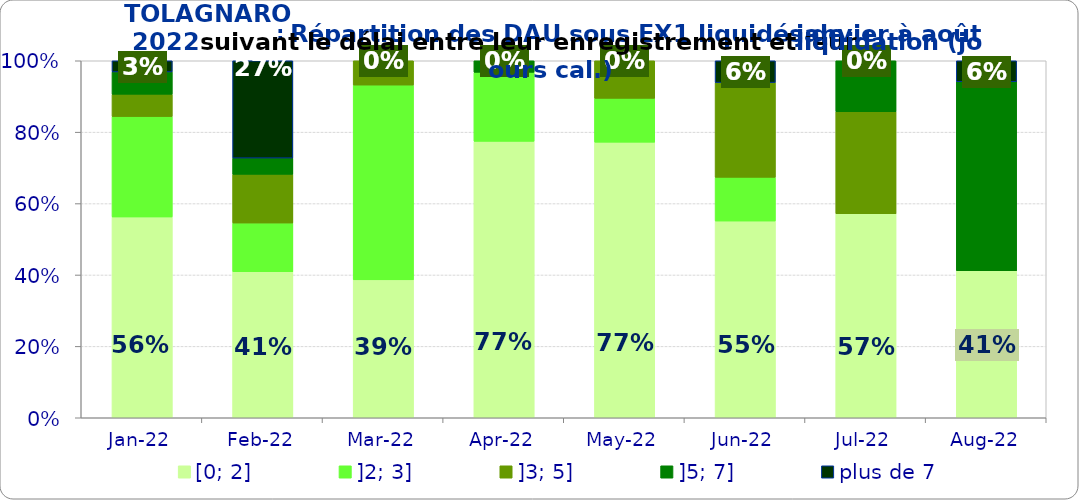
| Category | [0; 2] | ]2; 3] | ]3; 5] | ]5; 7] | plus de 7 |
|---|---|---|---|---|---|
| 2022-01-01 | 0.562 | 0.281 | 0.062 | 0.062 | 0.031 |
| 2022-02-01 | 0.409 | 0.136 | 0.136 | 0.045 | 0.273 |
| 2022-03-01 | 0.386 | 0.545 | 0.068 | 0 | 0 |
| 2022-04-01 | 0.774 | 0.194 | 0 | 0.032 | 0 |
| 2022-05-01 | 0.772 | 0.123 | 0.105 | 0 | 0 |
| 2022-06-01 | 0.551 | 0.122 | 0.265 | 0 | 0.061 |
| 2022-07-01 | 0.571 | 0 | 0.286 | 0.143 | 0 |
| 2022-08-01 | 0.412 | 0 | 0 | 0.529 | 0.059 |